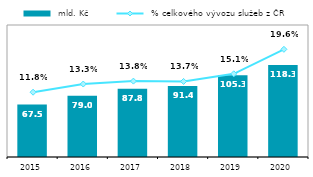
| Category |  mld. Kč |
|---|---|
| 2015.0 | 67.463 |
| 2016.0 | 79.004 |
| 2017.0 | 87.808 |
| 2018.0 | 91.441 |
| 2019.0 | 105.286 |
| 2020.0 | 118.327 |